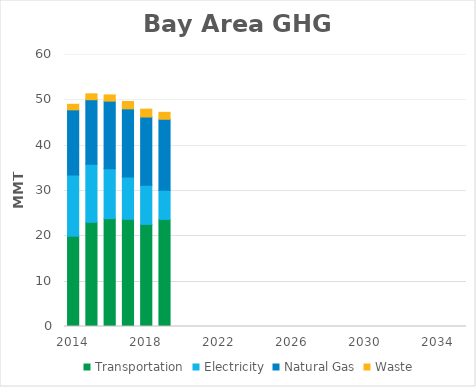
| Category | Transportation | Electricity | Natural Gas | Waste |
|---|---|---|---|---|
| 2014.0 | 19.919 | 13.525 | 14.351 | 1.218 |
| 2015.0 | 22.976 | 12.808 | 14.243 | 1.299 |
| 2016.0 | 23.795 | 11.028 | 14.887 | 1.375 |
| 2017.0 | 23.647 | 9.35 | 15.021 | 1.617 |
| 2018.0 | 22.518 | 8.644 | 15.053 | 1.738 |
| 2019.0 | 23.618 | 6.459 | 15.635 | 1.531 |
| 2020.0 | 0 | 0 | 0 | 0 |
| 2021.0 | 0 | 0 | 0 | 0 |
| 2022.0 | 0 | 0 | 0 | 0 |
| 2023.0 | 0 | 0 | 0 | 0 |
| 2024.0 | 0 | 0 | 0 | 0 |
| 2025.0 | 0 | 0 | 0 | 0 |
| 2026.0 | 0 | 0 | 0 | 0 |
| 2027.0 | 0 | 0 | 0 | 0 |
| 2028.0 | 0 | 0 | 0 | 0 |
| 2029.0 | 0 | 0 | 0 | 0 |
| 2030.0 | 0 | 0 | 0 | 0 |
| 2031.0 | 0 | 0 | 0 | 0 |
| 2032.0 | 0 | 0 | 0 | 0 |
| 2033.0 | 0 | 0 | 0 | 0 |
| 2034.0 | 0 | 0 | 0 | 0 |
| 2035.0 | 0 | 0 | 0 | 0 |